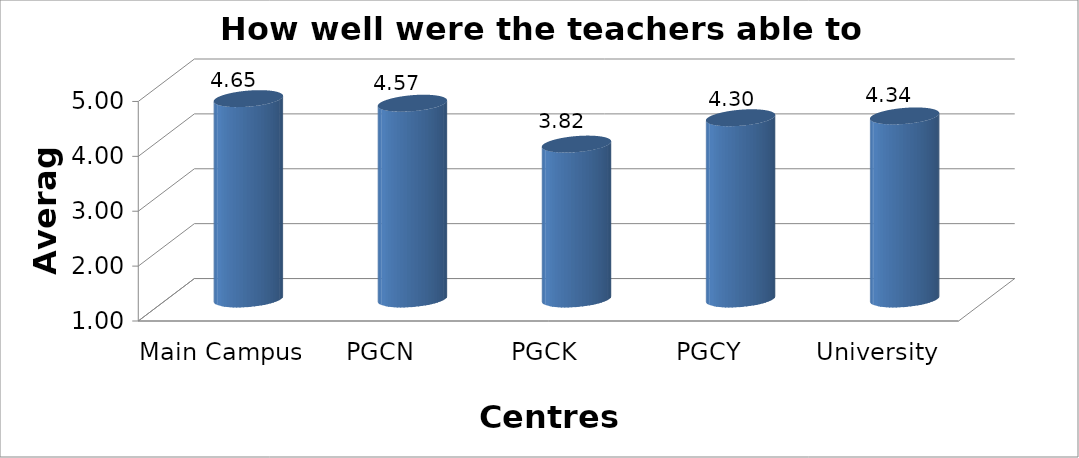
| Category | How well were the teachers able to communicate |
|---|---|
| Main Campus | 4.651 |
| PGCN | 4.568 |
| PGCK | 3.822 |
| PGCY | 4.302 |
| University Avg | 4.336 |